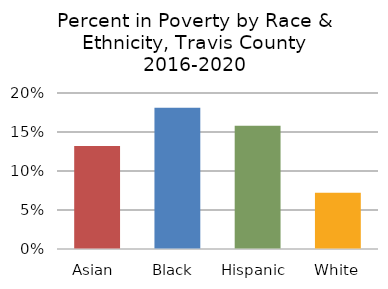
| Category | Total |
|---|---|
| Asian  | 0.132 |
| Black  | 0.181 |
| Hispanic  | 0.158 |
| White | 0.072 |